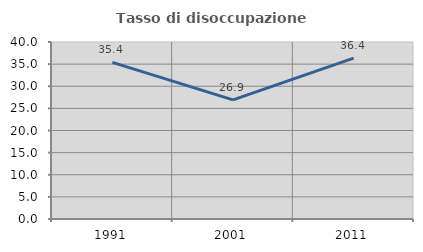
| Category | Tasso di disoccupazione giovanile  |
|---|---|
| 1991.0 | 35.385 |
| 2001.0 | 26.923 |
| 2011.0 | 36.364 |